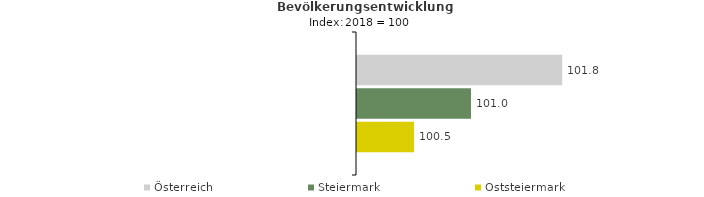
| Category | Österreich | Steiermark | Oststeiermark |
|---|---|---|---|
| 2022.0 | 101.8 | 101 | 100.5 |